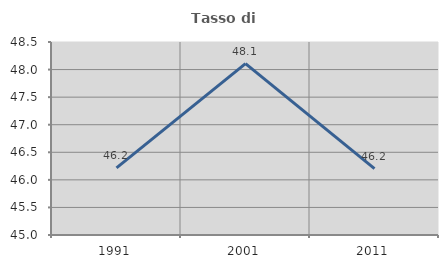
| Category | Tasso di occupazione   |
|---|---|
| 1991.0 | 46.219 |
| 2001.0 | 48.108 |
| 2011.0 | 46.203 |